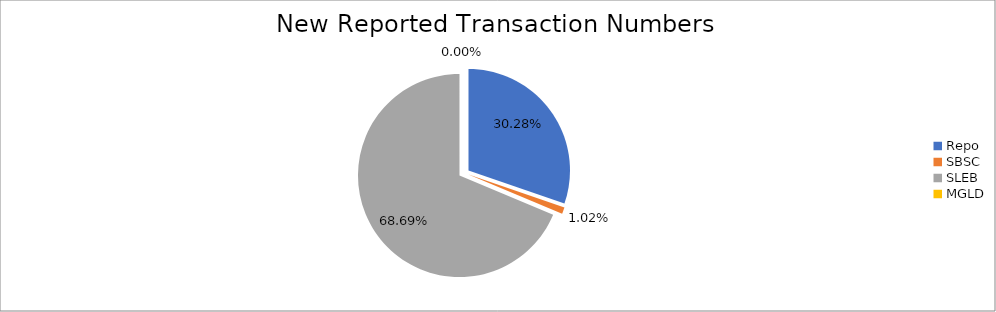
| Category | Series 0 |
|---|---|
| Repo | 277606 |
| SBSC | 9377 |
| SLEB | 629743 |
| MGLD | 24 |